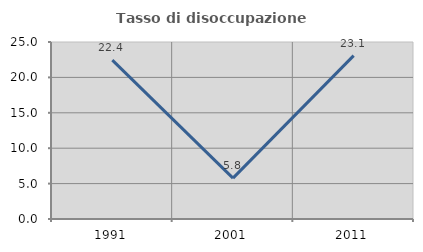
| Category | Tasso di disoccupazione giovanile  |
|---|---|
| 1991.0 | 22.449 |
| 2001.0 | 5.769 |
| 2011.0 | 23.077 |